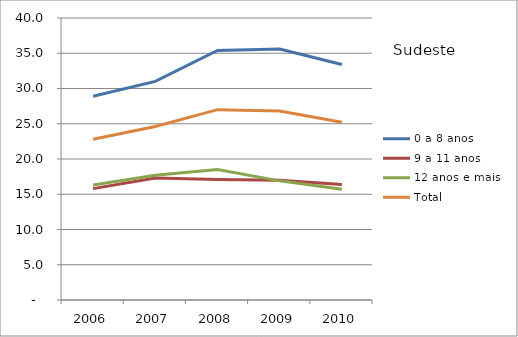
| Category | 0 a 8 anos | 9 a 11 anos | 12 anos e mais | Total |
|---|---|---|---|---|
| 2006.0 | 28.9 | 15.8 | 16.3 | 22.8 |
| 2007.0 | 31 | 17.3 | 17.7 | 24.6 |
| 2008.0 | 35.4 | 17.1 | 18.5 | 27 |
| 2009.0 | 35.6 | 17 | 16.9 | 26.8 |
| 2010.0 | 33.4 | 16.4 | 15.7 | 25.2 |